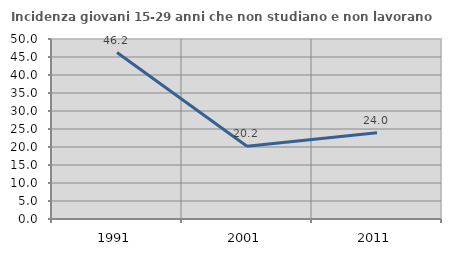
| Category | Incidenza giovani 15-29 anni che non studiano e non lavorano  |
|---|---|
| 1991.0 | 46.239 |
| 2001.0 | 20.229 |
| 2011.0 | 23.958 |